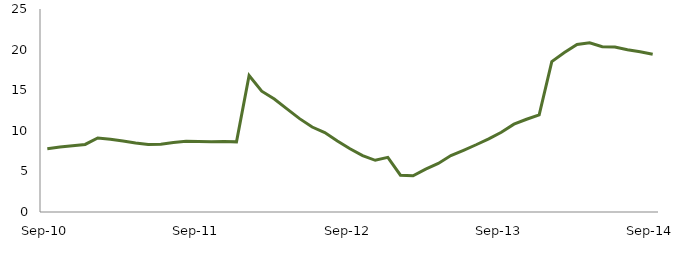
| Category | Series 0 |
|---|---|
| Sep-10 | 7.802 |
|  | 8.018 |
|  | 8.154 |
|  | 8.321 |
|  | 9.117 |
|  | 8.961 |
|  | 8.741 |
|  | 8.504 |
|  | 8.316 |
|  | 8.351 |
|  | 8.556 |
|  | 8.708 |
| Sep-11 | 8.67 |
|  | 8.643 |
|  | 8.672 |
|  | 8.638 |
|  | 16.809 |
|  | 14.88 |
|  | 13.91 |
|  | 12.702 |
|  | 11.496 |
|  | 10.465 |
|  | 9.782 |
|  | 8.747 |
| Sep-12 | 7.788 |
|  | 6.94 |
|  | 6.368 |
|  | 6.725 |
|  | 4.528 |
|  | 4.462 |
|  | 5.288 |
|  | 5.982 |
|  | 6.95 |
|  | 7.6 |
|  | 8.282 |
|  | 9.007 |
| Sep-13 | 9.818 |
|  | 10.818 |
|  | 11.424 |
|  | 11.963 |
|  | 18.523 |
|  | 19.632 |
|  | 20.625 |
|  | 20.848 |
|  | 20.351 |
|  | 20.33 |
|  | 19.98 |
|  | 19.734 |
| Sep-14 | 19.427 |